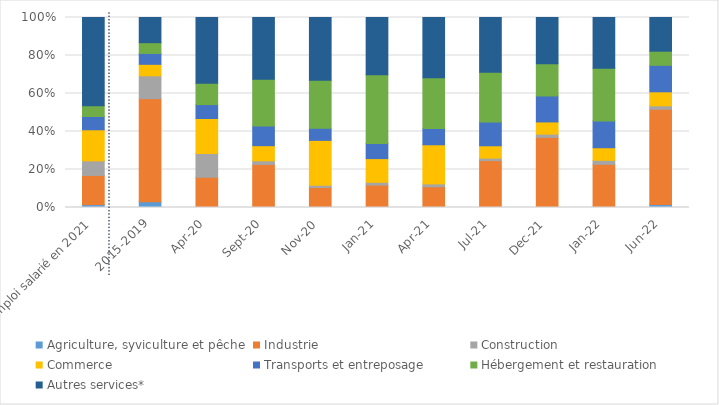
| Category | Agriculture, syviculture et pêche | Industrie | Construction | Commerce | Transports et entreposage | Hébergement et restauration | Autres services* |
|---|---|---|---|---|---|---|---|
| Emploi salarié en 2021 | 307750 | 3103275 | 1555175 | 3308650 | 1411950 | 1136525 | 9406550 |
| 2015-2019 | 1155 | 20790 | 4610 | 2315 | 2195 | 2170 | 5075 |
| avr-20 | 30515 | 1297830 | 1043640 | 1536435 | 611695 | 933060 | 2893335 |
| sept-20 | 2470 | 260060 | 21530 | 92140 | 119790 | 284530 | 376015 |
| nov-20 | 7325 | 298770 | 34385 | 685105 | 183300 | 736160 | 957605 |
| janv-21 | 5025 | 226715 | 29130 | 245315 | 157760 | 709565 | 593770 |
| avr-21 | 7070 | 281565 | 39845 | 545740 | 225705 | 707620 | 840505 |
| juil-21 | 1440 | 122105 | 6545 | 32555 | 62460 | 131075 | 144375 |
| déc-21 | 1210 | 126115 | 5820 | 22115 | 47100 | 58465 | 84005 |
| janv-22 | 810 | 82100 | 7680 | 24155 | 51240 | 101385 | 97470 |
| juin-22 | 2100 | 67730 | 2450 | 9980 | 18830 | 10035 | 23970 |